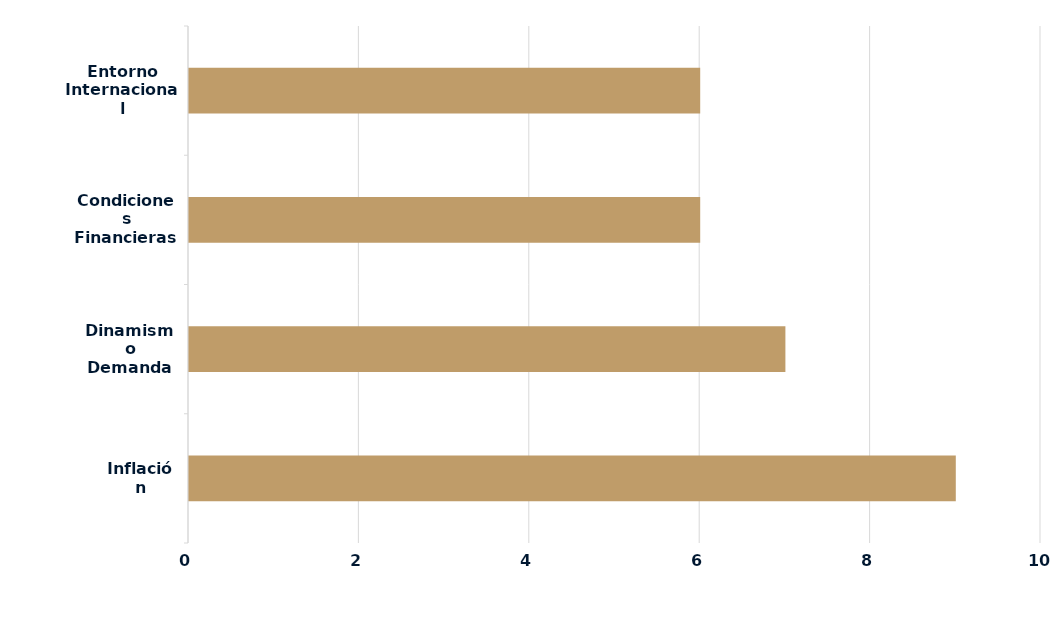
| Category | Series 0 |
|---|---|
| Inflación | 9 |
| Dinamismo Demanda | 7 |
| Condiciones Financieras Locales | 6 |
| Entorno Internacional | 6 |